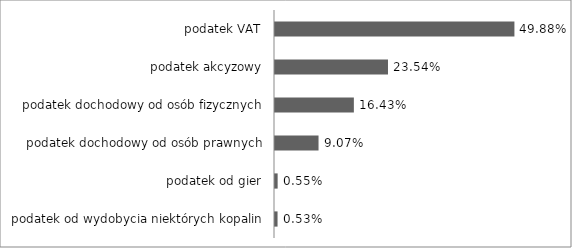
| Category | Series 0 |
|---|---|
| podatek od wydobycia niektórych kopalin | 0.005 |
| podatek od gier | 0.006 |
| podatek dochodowy od osób prawnych | 0.091 |
| podatek dochodowy od osób fizycznych | 0.164 |
| podatek akcyzowy | 0.235 |
| podatek VAT | 0.499 |